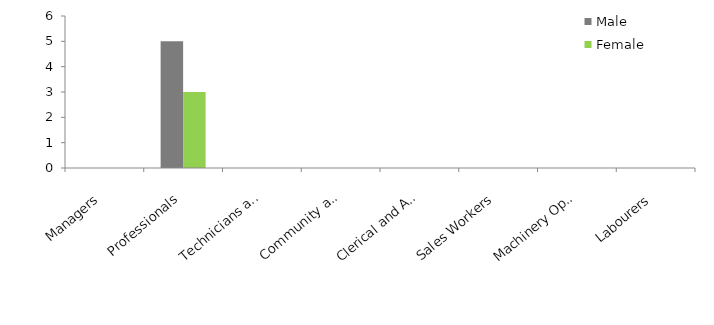
| Category | Male | Female |
|---|---|---|
| Managers | 0 | 0 |
| Professionals | 5 | 3 |
| Technicians and Trades Workers | 0 | 0 |
| Community and Personal Service Workers | 0 | 0 |
| Clerical and Administrative Workers | 0 | 0 |
| Sales Workers | 0 | 0 |
| Machinery Operators and Drivers | 0 | 0 |
| Labourers | 0 | 0 |